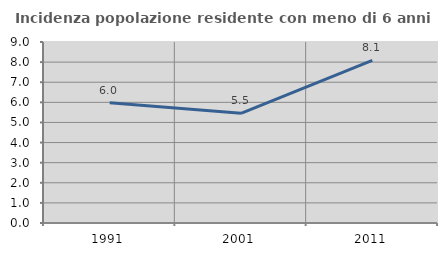
| Category | Incidenza popolazione residente con meno di 6 anni |
|---|---|
| 1991.0 | 5.979 |
| 2001.0 | 5.455 |
| 2011.0 | 8.085 |